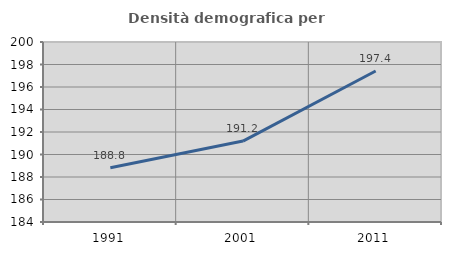
| Category | Densità demografica |
|---|---|
| 1991.0 | 188.815 |
| 2001.0 | 191.192 |
| 2011.0 | 197.419 |